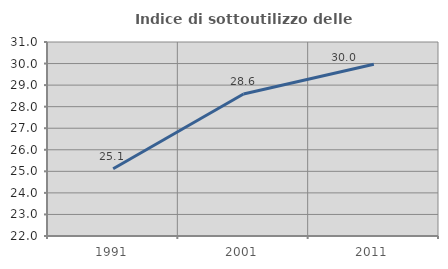
| Category | Indice di sottoutilizzo delle abitazioni  |
|---|---|
| 1991.0 | 25.118 |
| 2001.0 | 28.59 |
| 2011.0 | 29.965 |